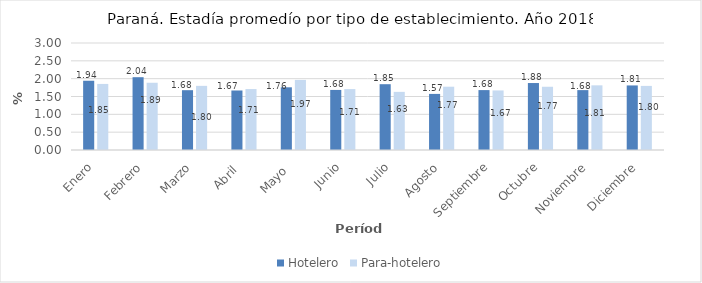
| Category | Hotelero | Para-hotelero |
|---|---|---|
| Enero | 1.942 | 1.852 |
| Febrero | 2.041 | 1.885 |
| Marzo | 1.677 | 1.798 |
| Abril  | 1.668 | 1.709 |
| Mayo  | 1.758 | 1.965 |
| Junio | 1.684 | 1.708 |
| Julio | 1.845 | 1.63 |
| Agosto | 1.573 | 1.774 |
| Septiembre | 1.68 | 1.67 |
| Octubre | 1.878 | 1.773 |
| Noviembre | 1.679 | 1.813 |
| Diciembre | 1.81 | 1.797 |